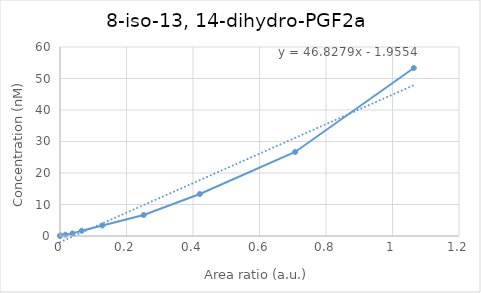
| Category | 8-iso-13, 14-dihydro-PGF2a |
|---|---|
| 0.0 | 0 |
| 0.000948047400933759 | 0.208 |
| 0.0162467881736356 | 0.417 |
| 0.03748860555444 | 0.833 |
| 0.065198158390012 | 1.667 |
| 0.127601316716537 | 3.333 |
| 0.251696380562052 | 6.667 |
| 0.420552882436223 | 13.333 |
| 0.707076282890515 | 26.667 |
| 1.06415881162529 | 53.333 |